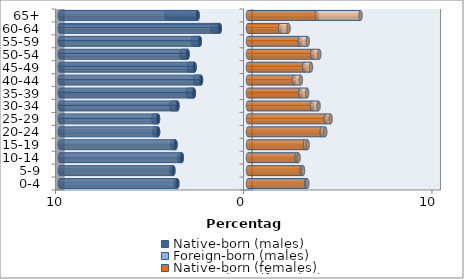
| Category | Native-born (males) | Foreign-born (males) | Native-born (females) | Foreign-born (females) |
|---|---|---|---|---|
| 0-4 | -3.753 | -0.083 | 3.093 | 0.059 |
| 5-9 | -3.964 | -0.094 | 2.853 | 0.072 |
| 10-14 | -3.517 | -0.124 | 2.586 | 0.101 |
| 15-19 | -3.85 | -0.164 | 3.029 | 0.141 |
| 20-24 | -4.778 | -0.194 | 3.919 | 0.186 |
| 25-29 | -4.78 | -0.248 | 4.131 | 0.259 |
| 30-34 | -3.748 | -0.318 | 3.409 | 0.338 |
| 35-39 | -2.876 | -0.32 | 2.788 | 0.354 |
| 40-44 | -2.497 | -0.313 | 2.444 | 0.365 |
| 45-49 | -2.84 | -0.301 | 2.993 | 0.352 |
| 50-54 | -3.21 | -0.324 | 3.419 | 0.37 |
| 55-59 | -2.56 | -0.366 | 2.758 | 0.419 |
| 60-64 | -1.502 | -0.388 | 1.709 | 0.444 |
| 65+ | -2.677 | -1.64 | 3.668 | 2.311 |